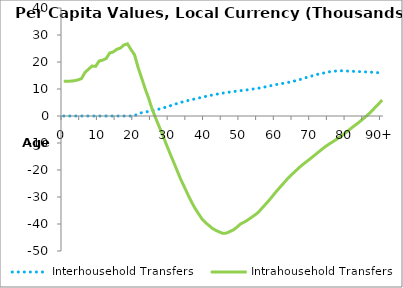
| Category | Interhousehold Transfers | Intrahousehold Transfers |
|---|---|---|
| 0 | 0 | 12833.232 |
|  | 0 | 12878.76 |
| 2 | 0 | 12924.289 |
| 3 | 0 | 13067.099 |
| 4 | 0 | 13363.144 |
| 5 | 0 | 13856.395 |
| 6 | 0 | 16130.808 |
| 7 | 0 | 17332.071 |
| 8 | 0 | 18514.471 |
| 9 | 0 | 18389.171 |
| 10 | 0 | 20358.018 |
| 11 | 0 | 20683.687 |
| 12 | 0 | 21311.313 |
| 13 | 0 | 23363.104 |
| 14 | 0 | 23733.075 |
| 15 | 0 | 24716.393 |
| 16 | 0 | 25147.573 |
| 17 | 0 | 26308.986 |
| 18 | 0 | 26730.318 |
| 19 | 0 | 24610.339 |
| 20 | 0 | 22672.841 |
| 21 | 978.731 | 17997.873 |
| 22 | 1197.151 | 14115.938 |
| 23 | 1485.181 | 10100.793 |
| 24 | 1690.68 | 6511.91 |
| 25 | 1948.391 | 2445.63 |
| 26 | 2239.303 | -892.525 |
| 27 | 2579.525 | -4039.194 |
| 28 | 2912.035 | -7210.712 |
| 29 | 3347.274 | -10561.107 |
| 30 | 3763.387 | -13797.79 |
| 31 | 4187.642 | -16934.087 |
| 32 | 4612.812 | -20104.802 |
| 33 | 5015.499 | -23304.072 |
| 34 | 5349.449 | -26063.468 |
| 35 | 5698.461 | -28869.637 |
| 36 | 6014.804 | -31584.731 |
| 37 | 6310.662 | -33988.694 |
| 38 | 6608.576 | -36024.817 |
| 39 | 6924.424 | -38014.266 |
| 40 | 7216.727 | -39415.125 |
| 41 | 7508.592 | -40521.529 |
| 42 | 7784.678 | -41629.017 |
| 43 | 8016.594 | -42362.405 |
| 44 | 8267.753 | -42965.074 |
| 45 | 8486.111 | -43475.942 |
| 46 | 8685.259 | -43356.832 |
| 47 | 8886.117 | -42743.408 |
| 48 | 9073.11 | -42126.481 |
| 49 | 9249.42 | -41089.677 |
| 50 | 9396.471 | -39942.714 |
| 51 | 9541.493 | -39314.22 |
| 52 | 9702.577 | -38503.616 |
| 53 | 9922.897 | -37587.176 |
| 54 | 10075.978 | -36671.139 |
| 55 | 10285.801 | -35646.409 |
| 56 | 10545.658 | -34140.64 |
| 57 | 10803.102 | -32727.369 |
| 58 | 11061.279 | -31268.993 |
| 59 | 11382.603 | -29654.689 |
| 60 | 11646.675 | -28057.25 |
| 61 | 11852.052 | -26543.727 |
| 62 | 12104.287 | -25097.982 |
| 63 | 12336.849 | -23588.97 |
| 64 | 12592.916 | -22252.268 |
| 65 | 12920.219 | -20970.487 |
| 66 | 13267.277 | -19776.678 |
| 67 | 13612.934 | -18562.905 |
| 68 | 14016.357 | -17528.158 |
| 69 | 14445.797 | -16503.289 |
| 70 | 14798.579 | -15476.269 |
| 71 | 15193.289 | -14406.565 |
| 72 | 15528.896 | -13331.551 |
| 73 | 15793.075 | -12279.796 |
| 74 | 16051.414 | -11273.882 |
| 75 | 16357.769 | -10375.486 |
| 76 | 16540.516 | -9567.354 |
| 77 | 16661.633 | -8706.646 |
| 78 | 16766.658 | -7794.268 |
| 79 | 16733.224 | -6865.872 |
| 80 | 16655.847 | -5820.518 |
| 81 | 16590.55 | -4763.649 |
| 82 | 16536.622 | -3736.148 |
| 83 | 16459.71 | -2776.757 |
| 84 | 16416.372 | -1696.439 |
| 85 | 16359.005 | -605.421 |
| 86 | 16295.333 | 540.052 |
| 87 | 16218.304 | 1771.215 |
| 88 | 16123.078 | 3194.035 |
| 89 | 16021.491 | 4547.914 |
| 90+ | 15919.904 | 5901.793 |